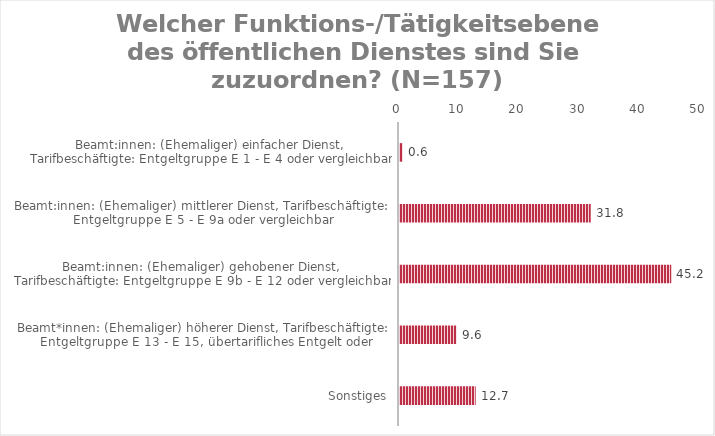
| Category | Gültige Prozente |
|---|---|
| Beamt:innen: (Ehemaliger) einfacher Dienst, Tarifbeschäftigte: Entgeltgruppe E 1 - E 4 oder vergleichbar | 0.637 |
| Beamt:innen: (Ehemaliger) mittlerer Dienst, Tarifbeschäftigte: Entgeltgruppe E 5 - E 9a oder vergleichbar | 31.847 |
| Beamt:innen: (Ehemaliger) gehobener Dienst, Tarifbeschäftigte: Entgeltgruppe E 9b - E 12 oder vergleichbar | 45.223 |
| Beamt*innen: (Ehemaliger) höherer Dienst, Tarifbeschäftigte: Entgeltgruppe E 13 - E 15, übertarifliches Entgelt oder | 9.554 |
| Sonstiges | 12.739 |